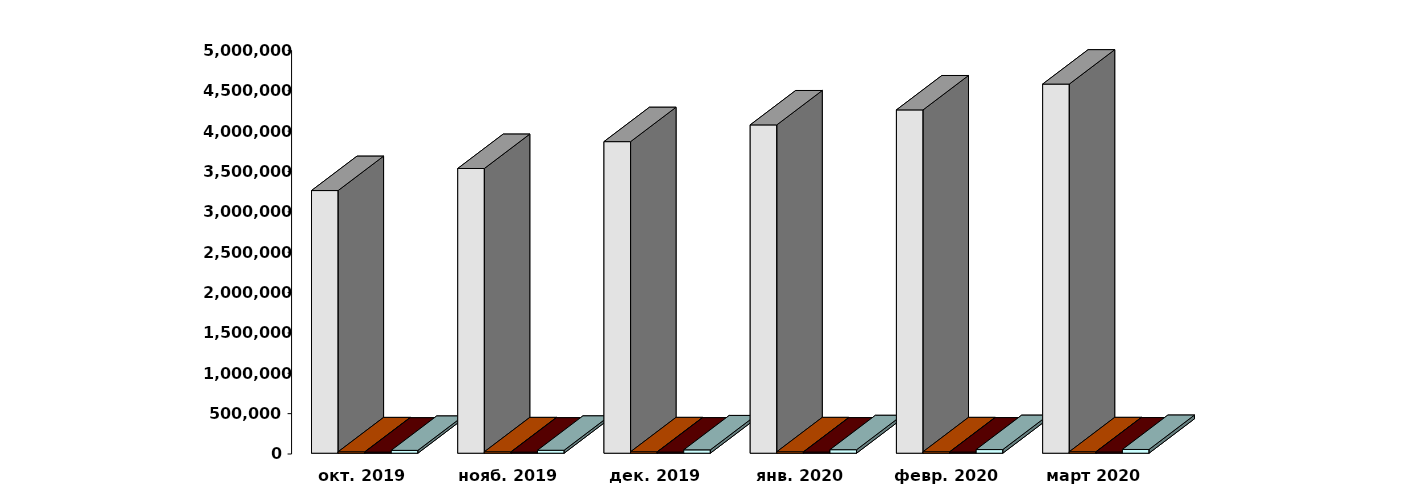
| Category | Физические лица | Юридические лица | Иностранные лица | Клиенты, передавшие свои средства в ДУ |
|---|---|---|---|---|
| 2019-10-29 | 3253953 | 17389 | 13455 | 35116 |
| 2019-11-29 | 3527188 | 17527 | 13688 | 36567 |
| 2019-12-29 | 3859911 | 17695 | 14011 | 41535 |
| 2020-01-29 | 4067317 | 17706 | 14182 | 43400 |
| 2020-02-29 | 4253153 | 17783 | 14404 | 45201 |
| 2020-03-31 | 4572906 | 17928 | 14988 | 46297 |